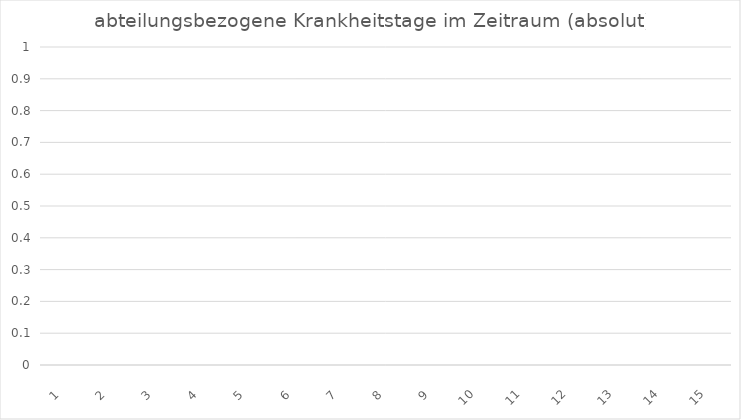
| Category | Gesamt (absolut) |
|---|---|
| 0 | 0 |
| 1 | 0 |
| 2 | 0 |
| 3 | 0 |
| 4 | 0 |
| 5 | 0 |
| 6 | 0 |
| 7 | 0 |
| 8 | 0 |
| 9 | 0 |
| 10 | 0 |
| 11 | 0 |
| 12 | 0 |
| 13 | 0 |
| 14 | 0 |